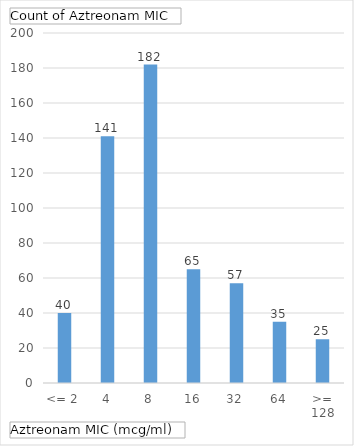
| Category | Total |
|---|---|
| <= 2 | 40 |
| 4 | 141 |
| 8 | 182 |
| 16 | 65 |
| 32 | 57 |
| 64 | 35 |
| >= 128 | 25 |